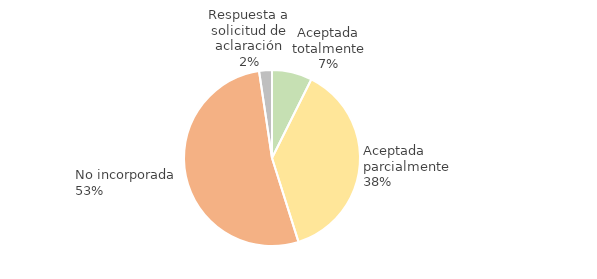
| Category | Series 0 |
|---|---|
| Aceptada totalmente | 0.074 |
| Aceptada parcialmente | 0.378 |
| No incorporada | 0.525 |
| Respuesta a solicitud de aclaración | 0.024 |